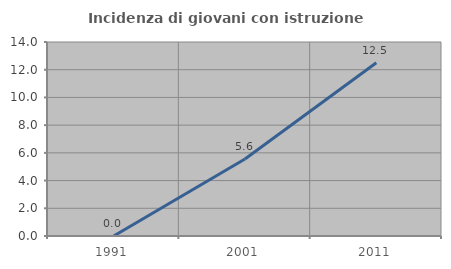
| Category | Incidenza di giovani con istruzione universitaria |
|---|---|
| 1991.0 | 0 |
| 2001.0 | 5.556 |
| 2011.0 | 12.5 |